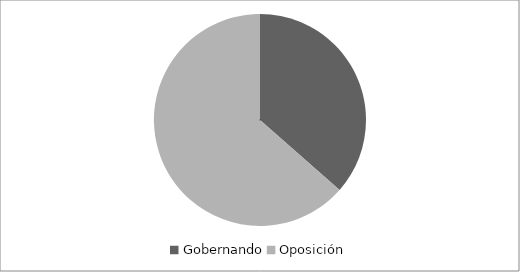
| Category | Series 0 |
|---|---|
| Gobernando | 27 |
| Oposición | 47 |